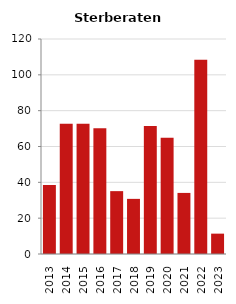
| Category | Sterberate der Bevölkerung ab 80 Jahre (auf Tsd.) |
|---|---|
| 2013.0 | 38.462 |
| 2014.0 | 72.727 |
| 2015.0 | 72.727 |
| 2016.0 | 70.175 |
| 2017.0 | 35.088 |
| 2018.0 | 30.769 |
| 2019.0 | 71.429 |
| 2020.0 | 64.935 |
| 2021.0 | 34.091 |
| 2022.0 | 108.434 |
| 2023.0 | 11.364 |